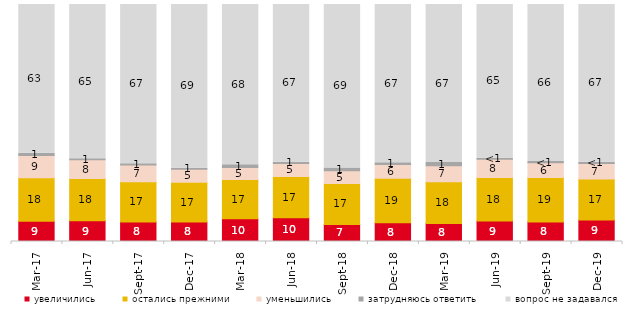
| Category | увеличились | остались прежними | уменьшились | затрудняюсь ответить | вопрос не задавался |
|---|---|---|---|---|---|
| 2017-03-01 | 8.5 | 18.35 | 9.4 | 0.95 | 62.8 |
| 2017-06-01 | 8.8 | 17.75 | 7.9 | 0.5 | 65.05 |
| 2017-09-01 | 8.2 | 17 | 7.1 | 0.5 | 67.2 |
| 2017-12-01 | 8.25 | 16.8 | 5.4 | 0.5 | 69.05 |
| 2018-03-01 | 9.55 | 16.65 | 5.05 | 1.1 | 67.65 |
| 2018-06-01 | 10 | 17.45 | 5.45 | 0.55 | 66.55 |
| 2018-09-01 | 7.2 | 17.3 | 5.3 | 1.2 | 69 |
| 2018-12-01 | 7.9 | 18.8 | 5.8 | 0.75 | 66.75 |
| 2019-03-01 | 7.608 | 17.653 | 6.713 | 1.343 | 66.683 |
| 2019-06-01 | 8.678 | 18.354 | 7.631 | 0.499 | 64.838 |
| 2019-09-01 | 8.267 | 18.762 | 6.188 | 0.495 | 66.287 |
| 2019-12-01 | 9.059 | 17.277 | 6.584 | 0.495 | 66.584 |